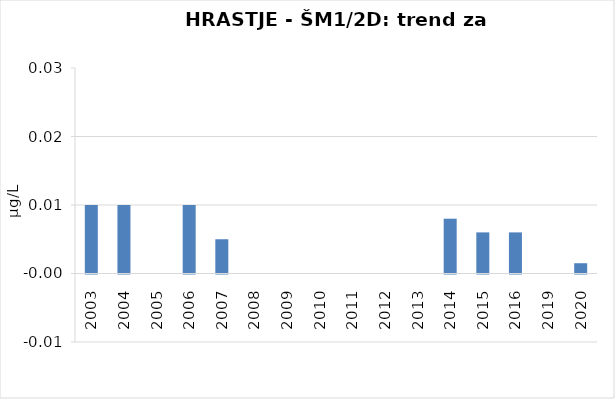
| Category | Vsota |
|---|---|
| 2003 | 0.01 |
| 2004 | 0.01 |
| 2005 | 0 |
| 2006 | 0.01 |
| 2007 | 0.005 |
| 2008 | 0 |
| 2009 | 0 |
| 2010 | 0 |
| 2011 | 0 |
| 2012 | 0 |
| 2013 | 0 |
| 2014 | 0.008 |
| 2015 | 0.006 |
| 2016 | 0.006 |
| 2019 | 0 |
| 2020 | 0.002 |